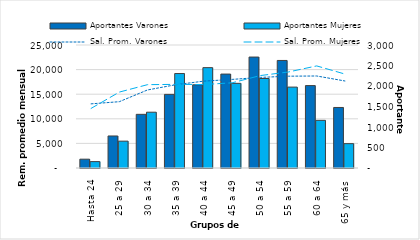
| Category | Aportantes Varones | Aportantes Mujeres |
|---|---|---|
| 0 | 215 | 156 |
| 1 | 781 | 655 |
| 2 | 1309 | 1361 |
| 3 | 1796 | 2304 |
| 4 | 2029 | 2448 |
| 5 | 2291 | 2065 |
| 6 | 2706 | 2183 |
| 7 | 2623 | 1973 |
| 8 | 2010 | 1162 |
| 9 | 1476 | 594 |